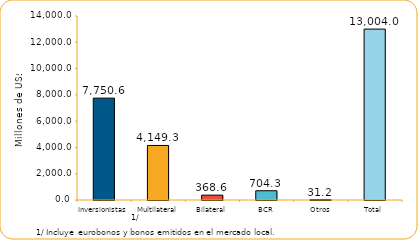
| Category | Series 1 |
|---|---|
| Inversionistas | 7750.6 |
| Multilateral | 4149.3 |
| Bilateral | 368.6 |
| BCR | 704.3 |
| Otros | 31.2 |
| Total | 13004 |